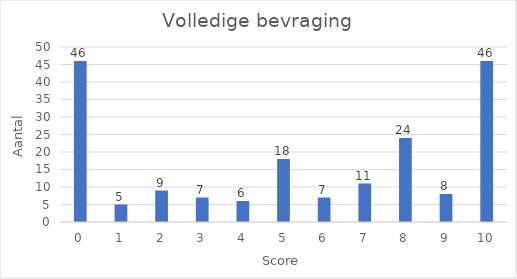
| Category | Aantal |
|---|---|
| 0.0 | 46 |
| 1.0 | 5 |
| 2.0 | 9 |
| 3.0 | 7 |
| 4.0 | 6 |
| 5.0 | 18 |
| 6.0 | 7 |
| 7.0 | 11 |
| 8.0 | 24 |
| 9.0 | 8 |
| 10.0 | 46 |